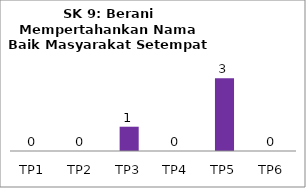
| Category | Bil Pel |
|---|---|
| TP1 | 0 |
| TP2 | 0 |
| TP3 | 1 |
| TP4 | 0 |
| TP5 | 3 |
| TP6 | 0 |